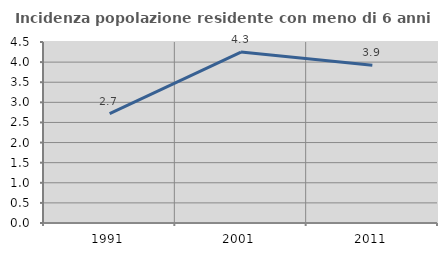
| Category | Incidenza popolazione residente con meno di 6 anni |
|---|---|
| 1991.0 | 2.721 |
| 2001.0 | 4.25 |
| 2011.0 | 3.922 |